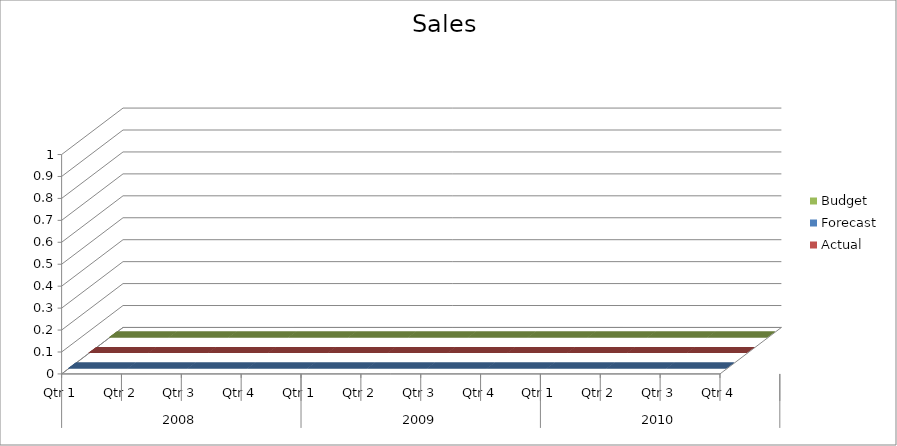
| Category | Budget | Forecast | Actual |
|---|---|---|---|
| 0 | 3380 | 1370 | 900 |
| 1 | 2440 | 1280 | 3320 |
| 2 | 3180 | 2310 | 850 |
| 3 | 1560 | 2030 | 830 |
| 4 | 2330 | 3280 | 860 |
| 5 | 1260 | 1830 | 3470 |
| 6 | 520 | 2440 | 3270 |
| 7 | 2820 | 1640 | 1540 |
| 8 | 3080 | 1640 | 2290 |
| 9 | 1180 | 2800 | 1910 |
| 10 | 910 | 1970 | 2930 |
| 11 | 2240 | 1830 | 1860 |